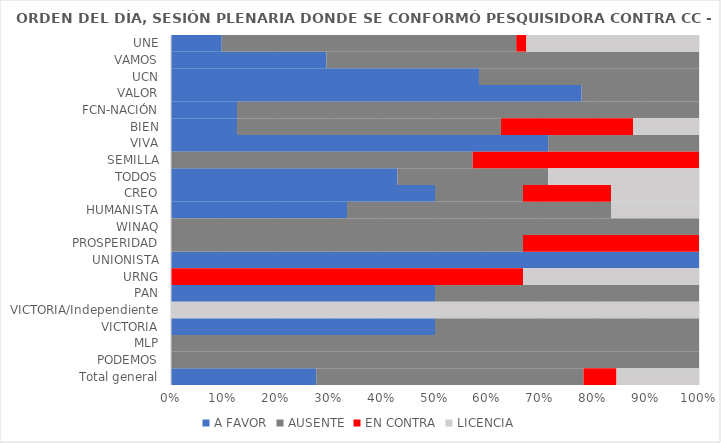
| Category | A FAVOR | AUSENTE | EN CONTRA | LICENCIA |
|---|---|---|---|---|
| UNE | 0.096 | 0.558 | 0.019 | 0.327 |
| VAMOS | 0.294 | 0.706 | 0 | 0 |
| UCN | 0.583 | 0.417 | 0 | 0 |
| VALOR | 0.778 | 0.222 | 0 | 0 |
| FCN-NACIÓN | 0.125 | 0.875 | 0 | 0 |
| BIEN | 0.125 | 0.5 | 0.25 | 0.125 |
| VIVA | 0.714 | 0.286 | 0 | 0 |
| SEMILLA | 0 | 0.571 | 0.429 | 0 |
| TODOS | 0.429 | 0.286 | 0 | 0.286 |
| CREO | 0.5 | 0.167 | 0.167 | 0.167 |
| HUMANISTA | 0.333 | 0.5 | 0 | 0.167 |
| WINAQ | 0 | 1 | 0 | 0 |
| PROSPERIDAD | 0 | 0.667 | 0.333 | 0 |
| UNIONISTA | 1 | 0 | 0 | 0 |
| URNG | 0 | 0 | 0.667 | 0.333 |
| PAN | 0.5 | 0.5 | 0 | 0 |
| VICTORIA/Independiente | 0 | 0 | 0 | 1 |
| VICTORIA | 0.5 | 0.5 | 0 | 0 |
| MLP | 0 | 1 | 0 | 0 |
| PODEMOS | 0 | 1 | 0 | 0 |
| Total general | 0.275 | 0.506 | 0.062 | 0.156 |